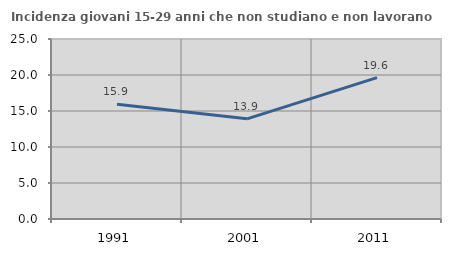
| Category | Incidenza giovani 15-29 anni che non studiano e non lavorano  |
|---|---|
| 1991.0 | 15.932 |
| 2001.0 | 13.909 |
| 2011.0 | 19.643 |